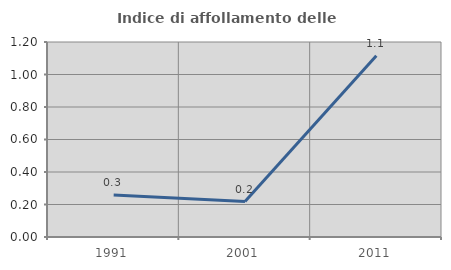
| Category | Indice di affollamento delle abitazioni  |
|---|---|
| 1991.0 | 0.258 |
| 2001.0 | 0.218 |
| 2011.0 | 1.115 |